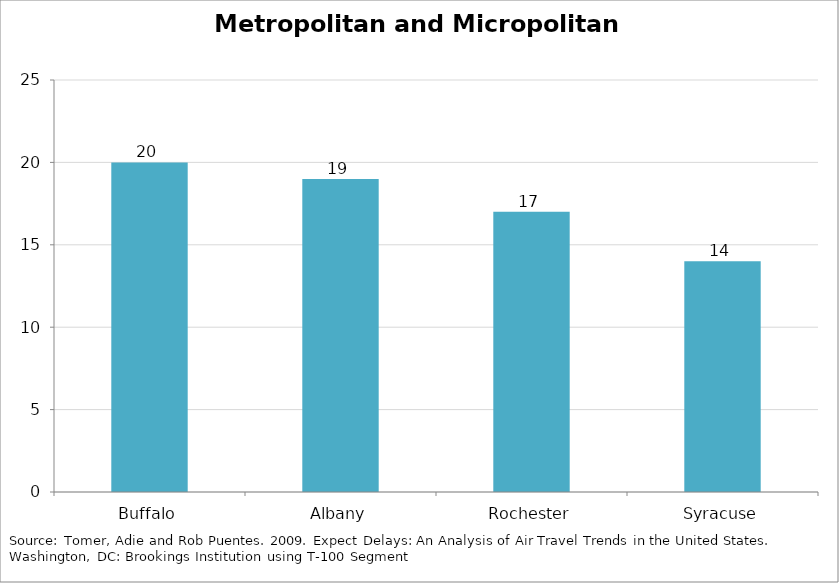
| Category | Metropolitan and Micropolitan Connections |
|---|---|
| Buffalo | 20 |
| Albany | 19 |
| Rochester | 17 |
| Syracuse | 14 |